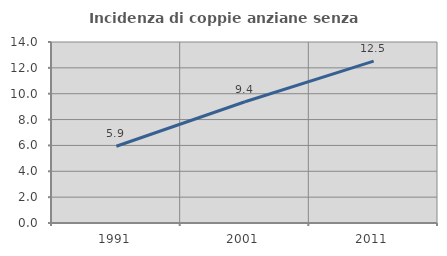
| Category | Incidenza di coppie anziane senza figli  |
|---|---|
| 1991.0 | 5.937 |
| 2001.0 | 9.378 |
| 2011.0 | 12.524 |